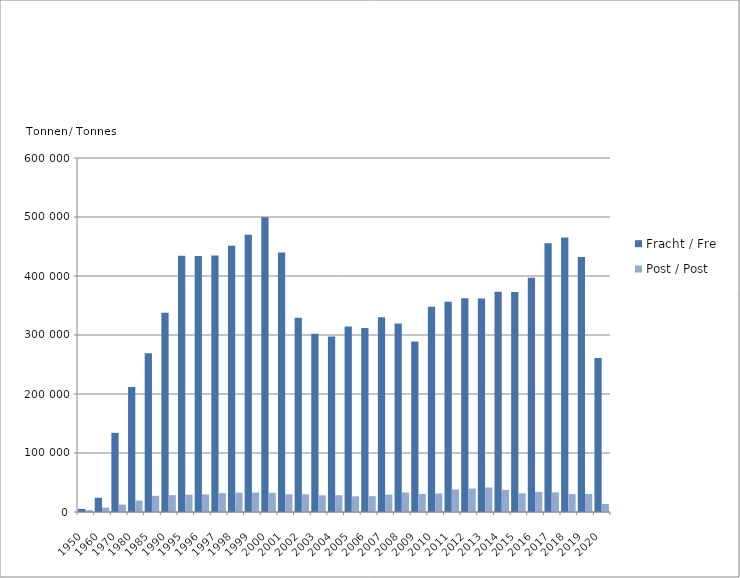
| Category | Fracht / Fret | Post / Post |
|---|---|---|
| 1950.0 | 5237 | 3202 |
| 1960.0 | 24133 | 7534 |
| 1970.0 | 134234 | 12539 |
| 1980.0 | 211921 | 19326 |
| 1985.0 | 268957 | 27445 |
| 1990.0 | 337907 | 28567 |
| 1995.0 | 434432 | 29345 |
| 1996.0 | 433814 | 29878 |
| 1997.0 | 434646 | 32029 |
| 1998.0 | 451429 | 32849 |
| 1999.0 | 470069 | 33030 |
| 2000.0 | 499552 | 32493 |
| 2001.0 | 439710 | 30052 |
| 2002.0 | 329396 | 30094 |
| 2003.0 | 301988 | 28358 |
| 2004.0 | 297582 | 28446 |
| 2005.0 | 314334 | 26458 |
| 2006.0 | 311760 | 26828 |
| 2007.0 | 330023 | 29518 |
| 2008.0 | 319530 | 33029 |
| 2009.0 | 288855 | 30594 |
| 2010.0 | 348091 | 31298 |
| 2011.0 | 356231 | 38192 |
| 2012.0 | 362151 | 39719 |
| 2013.0 | 361681 | 41569 |
| 2014.0 | 373144 | 37489 |
| 2015.0 | 372924 | 31708 |
| 2016.0 | 397064 | 34077 |
| 2017.0 | 455345 | 33269 |
| 2018.0 | 465363 | 30387 |
| 2019.0 | 432144 | 30645 |
| 2020.0 | 261103 | 13597 |